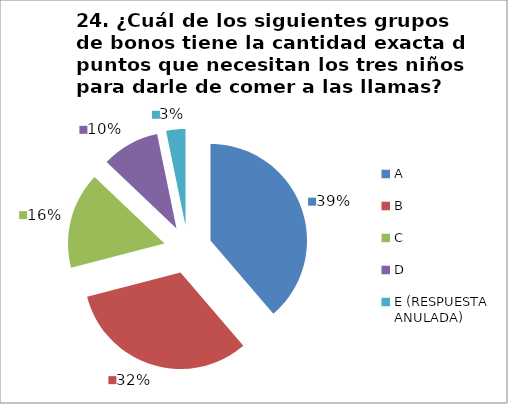
| Category | CANTIDAD DE RESPUESTAS PREGUNTA (24) | PORCENTAJE |
|---|---|---|
| A | 12 | 0.387 |
| B | 10 | 0.323 |
| C | 5 | 0.161 |
| D | 3 | 0.097 |
| E (RESPUESTA ANULADA) | 1 | 0.032 |